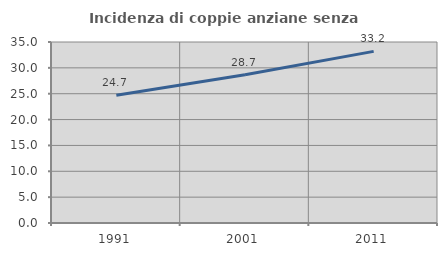
| Category | Incidenza di coppie anziane senza figli  |
|---|---|
| 1991.0 | 24.699 |
| 2001.0 | 28.674 |
| 2011.0 | 33.19 |